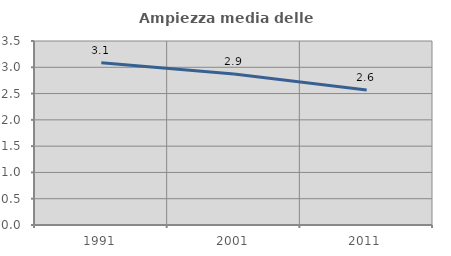
| Category | Ampiezza media delle famiglie |
|---|---|
| 1991.0 | 3.088 |
| 2001.0 | 2.871 |
| 2011.0 | 2.567 |